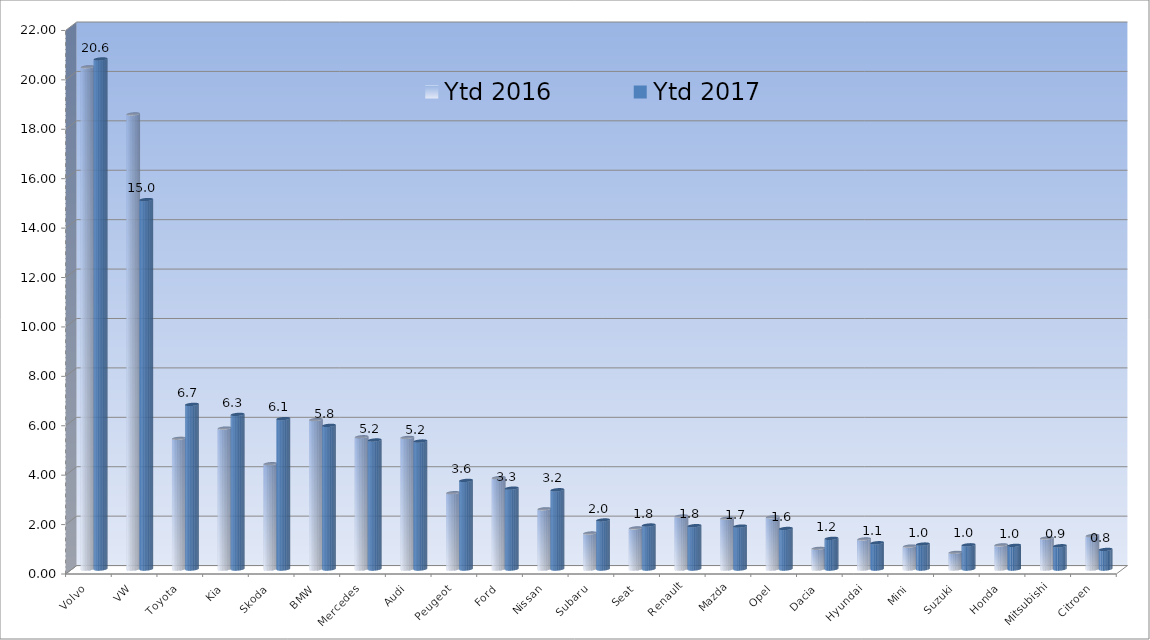
| Category | Ytd 2016 | Ytd 2017 |
|---|---|---|
| Volvo | 20.325 | 20.644 |
| VW | 18.418 | 14.952 |
| Toyota | 5.292 | 6.662 |
| Kia | 5.704 | 6.258 |
| Skoda | 4.261 | 6.088 |
| BMW | 6.048 | 5.814 |
| Mercedes | 5.352 | 5.222 |
| Audi | 5.326 | 5.178 |
| Peugeot | 3.088 | 3.586 |
| Ford | 3.698 | 3.272 |
| Nissan | 2.435 | 3.207 |
| Subaru | 1.456 | 1.984 |
| Seat | 1.662 | 1.78 |
| Renault | 2.143 | 1.754 |
| Mazda | 2.057 | 1.736 |
| Opel | 2.109 | 1.641 |
| Dacia | 0.838 | 1.24 |
| Hyundai | 1.216 | 1.062 |
| Mini | 0.928 | 1.01 |
| Suzuki | 0.674 | 0.979 |
| Honda | 0.975 | 0.957 |
| Mitsubishi | 1.254 | 0.94 |
| Citroen | 1.353 | 0.792 |